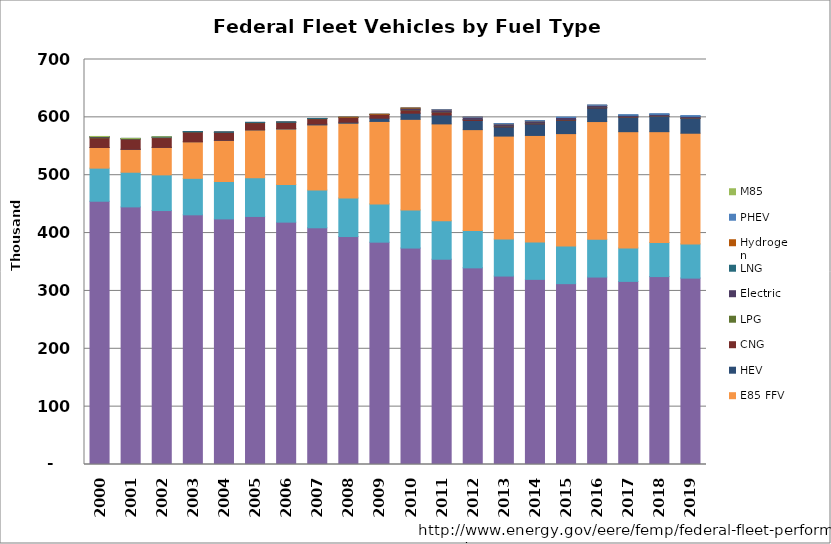
| Category | Gasoline | Diesel | E85 FFV | HEV | CNG | LPG | Electric | LNG | Hydrogen | PHEV | M85 |
|---|---|---|---|---|---|---|---|---|---|---|---|
| 2000.0 | 455018 | 57213 | 35728 | 8 | 16549 | 1270 | 1084 | 59 | 0 | 0 | 80 |
| 2001.0 | 445243 | 59912 | 39552 | 192 | 17541 | 524 | 611 | 39 | 0 | 0 | 13 |
| 2002.0 | 438934 | 61656 | 47573 | 16 | 16773 | 387 | 885 | 39 | 0 | 0 | 74 |
| 2003.0 | 431551 | 63063 | 63254 | 40 | 16590 | 343 | 641 | 52 | 0 | 0 | 0 |
| 2004.0 | 424476 | 64558 | 71214 | 339 | 13539 | 349 | 134 | 51 | 0 | 0 | 0 |
| 2005.0 | 428737 | 66949 | 82591 | 405 | 12135 | 308 | 182 | 51 | 0 | 0 | 0 |
| 2006.0 | 418892 | 65058 | 95880 | 902 | 10769 | 292 | 110 | 64 | 0 | 0 | 0 |
| 2007.0 | 409133 | 65173 | 112605 | 1480 | 9286 | 308 | 100 | 34 | 0 | 0 | 0 |
| 2008.0 | 394016 | 66602 | 129251 | 1766 | 8197 | 216 | 83 | 33 | 2 | 0 | 0 |
| 2009.0 | 384273 | 66185 | 142501 | 5574 | 6474 | 181 | 56 | 20 | 4 | 0 | 0 |
| 2010.0 | 374105 | 65762 | 156689 | 10621 | 5659 | 150 | 2982 | 7 | 5 | 0 | 0 |
| 2011.0 | 354797 | 66450 | 167450 | 15412 | 5092 | 133 | 3689 | 0 | 7 | 9 | 0 |
| 2012.0 | 339857 | 64461 | 174469 | 15883 | 1666 | 142 | 3757 | 0 | 4 | 166 | 0 |
| 2013.0 | 325694 | 63935 | 177991 | 15834 | 1437 | 204 | 3609 | 2 | 5 | 507 | 0 |
| 2014.0 | 320014 | 64662 | 184042 | 19887 | 1317 | 189 | 3696 | 4 | 5 | 563 | 0 |
| 2015.0 | 312583 | 65120 | 194210 | 22863 | 1207 | 158 | 3578 | 7 | 1 | 759 | 0 |
| 2016.0 | 323983 | 65271 | 203497 | 23519 | 1062 | 177 | 3221 | 7 | 1 | 593 | 0 |
| 2017.0 | 316465 | 57819 | 200950 | 25059 | 798 | 121 | 2560 | 2 | 0 | 724 | 0 |
| 2018.0 | 324809 | 58904 | 191563 | 26152 | 628 | 122 | 3129 | 3 | 0 | 980 | 0 |
| 2019.0 | 322130 | 59161 | 191269 | 25635 | 576 | 134 | 2966 | 1 | 0 | 1185 | 0 |